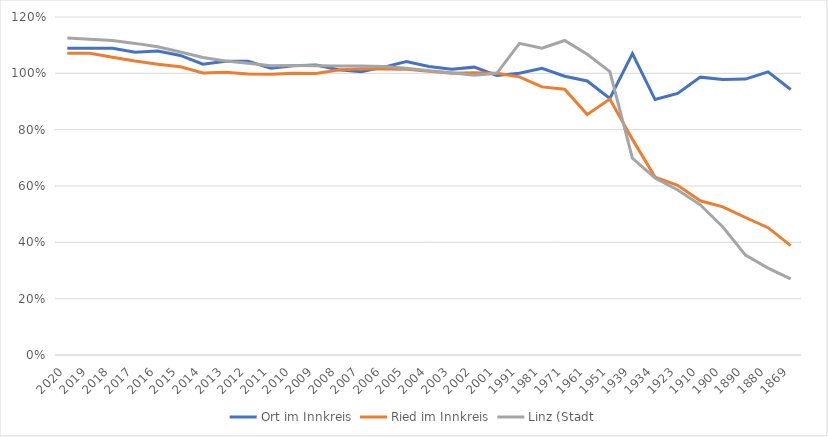
| Category | Ort im Innkreis | Ried im Innkreis | Linz (Stadt |
|---|---|---|---|
| 2020.0 | 1.089 | 1.072 | 1.126 |
| 2019.0 | 1.089 | 1.072 | 1.121 |
| 2018.0 | 1.089 | 1.057 | 1.116 |
| 2017.0 | 1.075 | 1.044 | 1.106 |
| 2016.0 | 1.08 | 1.033 | 1.094 |
| 2015.0 | 1.064 | 1.024 | 1.076 |
| 2014.0 | 1.032 | 1.001 | 1.056 |
| 2013.0 | 1.043 | 1.004 | 1.044 |
| 2012.0 | 1.043 | 0.998 | 1.036 |
| 2011.0 | 1.018 | 0.997 | 1.027 |
| 2010.0 | 1.027 | 1 | 1.027 |
| 2009.0 | 1.03 | 1 | 1.027 |
| 2008.0 | 1.013 | 1.012 | 1.026 |
| 2007.0 | 1.006 | 1.016 | 1.026 |
| 2006.0 | 1.022 | 1.015 | 1.024 |
| 2005.0 | 1.041 | 1.015 | 1.018 |
| 2004.0 | 1.025 | 1.007 | 1.009 |
| 2003.0 | 1.014 | 1 | 1.002 |
| 2002.0 | 1.022 | 1.002 | 0.993 |
| 2001.0 | 0.992 | 1 | 1 |
| 1991.0 | 1 | 0.987 | 1.106 |
| 1981.0 | 1.018 | 0.952 | 1.089 |
| 1971.0 | 0.99 | 0.943 | 1.117 |
| 1961.0 | 0.973 | 0.854 | 1.068 |
| 1951.0 | 0.911 | 0.909 | 1.006 |
| 1939.0 | 1.07 | 0.766 | 0.698 |
| 1934.0 | 0.907 | 0.632 | 0.629 |
| 1923.0 | 0.929 | 0.602 | 0.586 |
| 1910.0 | 0.986 | 0.548 | 0.533 |
| 1900.0 | 0.978 | 0.526 | 0.454 |
| 1890.0 | 0.98 | 0.488 | 0.355 |
| 1880.0 | 1.005 | 0.452 | 0.308 |
| 1869.0 | 0.942 | 0.388 | 0.27 |